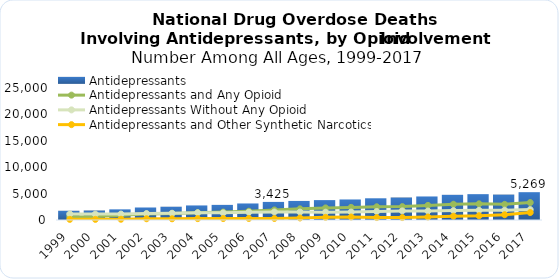
| Category | Antidepressants |
|---|---|
| 1999.0 | 1749 |
| 2000.0 | 1798 |
| 2001.0 | 2017 |
| 2002.0 | 2370 |
| 2003.0 | 2512 |
| 2004.0 | 2758 |
| 2005.0 | 2861 |
| 2006.0 | 3133 |
| 2007.0 | 3425 |
| 2008.0 | 3610 |
| 2009.0 | 3768 |
| 2010.0 | 3889 |
| 2011.0 | 4113 |
| 2012.0 | 4259 |
| 2013.0 | 4458 |
| 2014.0 | 4768 |
| 2015.0 | 4894 |
| 2016.0 | 4812 |
| 2017.0 | 5269 |